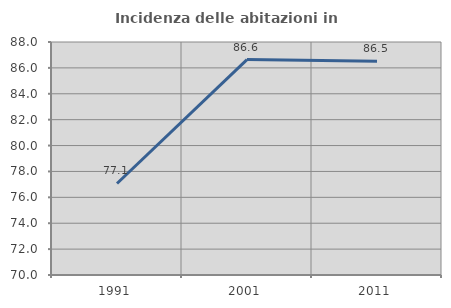
| Category | Incidenza delle abitazioni in proprietà  |
|---|---|
| 1991.0 | 77.07 |
| 2001.0 | 86.639 |
| 2011.0 | 86.508 |